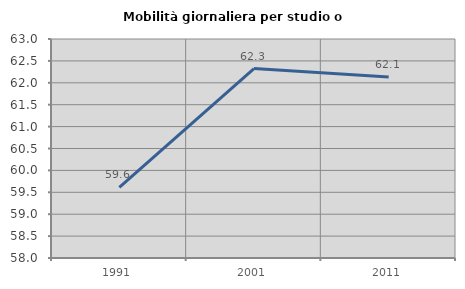
| Category | Mobilità giornaliera per studio o lavoro |
|---|---|
| 1991.0 | 59.611 |
| 2001.0 | 62.325 |
| 2011.0 | 62.132 |